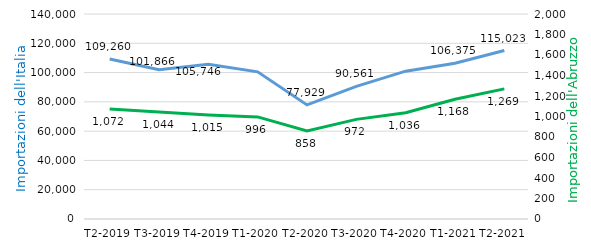
| Category | Series 0 |
|---|---|
| T2-2019 | 109259.576 |
| T3-2019 | 101865.82 |
| T4-2019 | 105746.413 |
| T1-2020 | 100508.18 |
| T2-2020 | 77928.5 |
| T3-2020 | 90561.238 |
| T4-2020 | 100971.49 |
| T1-2021 | 106375.017 |
| T2-2021 | 115023.114 |